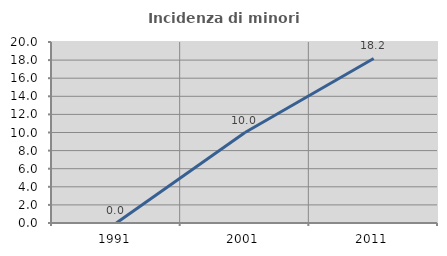
| Category | Incidenza di minori stranieri |
|---|---|
| 1991.0 | 0 |
| 2001.0 | 10 |
| 2011.0 | 18.182 |